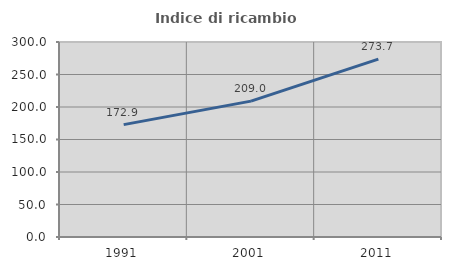
| Category | Indice di ricambio occupazionale  |
|---|---|
| 1991.0 | 172.895 |
| 2001.0 | 209.043 |
| 2011.0 | 273.713 |